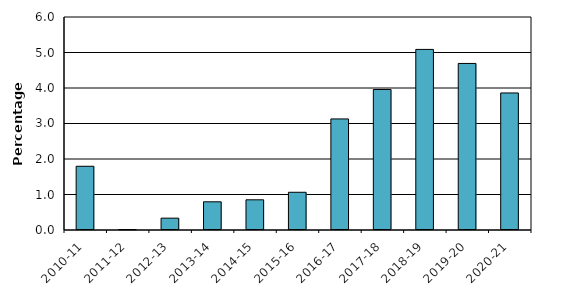
| Category | Percentage change |
|---|---|
| 2010-11 | 1.795 |
| 2011-12 | 0.008 |
| 2012-13 | 0.333 |
| 2013-14 | 0.794 |
| 2014-15 | 0.851 |
| 2015-16 | 1.063 |
| 2016-17 | 3.129 |
| 2017-18 | 3.958 |
| 2018-19 | 5.087 |
| 2019-20 | 4.692 |
| 2020-21 | 3.86 |